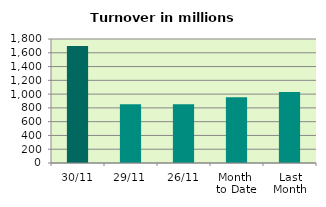
| Category | Series 0 |
|---|---|
| 30/11 | 1698.798 |
| 29/11 | 854.531 |
| 26/11 | 851.328 |
| Month 
to Date | 954.978 |
| Last
Month | 1032.218 |